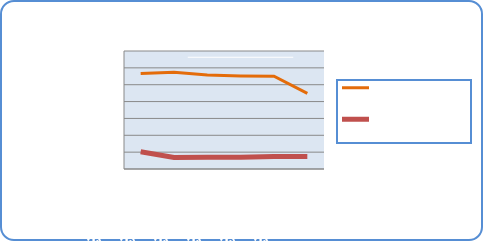
| Category | Motorin Türleri | Benzin Türleri |
|---|---|---|
| 2/18/19 | 56683713.692 | 10252853.569 |
| 2/19/19 | 57339198.048 | 6808970.682 |
| 2/20/19 | 55818115.233 | 6918473.793 |
| 2/21/19 | 55209849.673 | 6915725.44 |
| 2/22/19 | 55019849.913 | 7450520.481 |
| 2/23/19 | 44898197 | 7419304.163 |